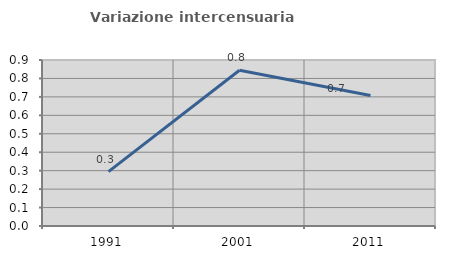
| Category | Variazione intercensuaria annua |
|---|---|
| 1991.0 | 0.295 |
| 2001.0 | 0.844 |
| 2011.0 | 0.708 |